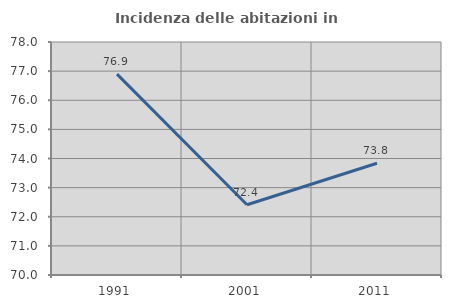
| Category | Incidenza delle abitazioni in proprietà  |
|---|---|
| 1991.0 | 76.897 |
| 2001.0 | 72.414 |
| 2011.0 | 73.839 |